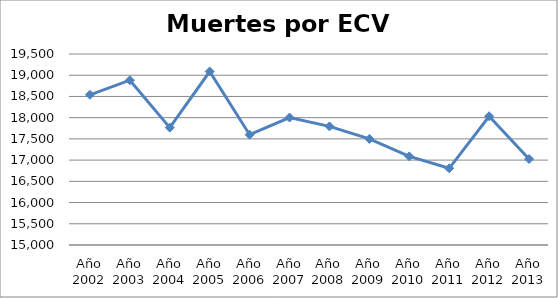
| Category | Series 0 |
|---|---|
| Año 2002 | 18539 |
| Año 2003 | 18883 |
| Año 2004 | 17766 |
| Año 2005 | 19087 |
| Año 2006 | 17599 |
| Año 2007 | 18003 |
| Año 2008 | 17794 |
| Año 2009 | 17499 |
| Año 2010 | 17087 |
| Año 2011 | 16807 |
| Año 2012 | 18034 |
| Año 2013 | 17026 |